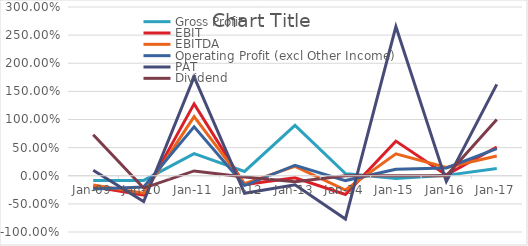
| Category | Gross Profit | EBIT | EBITDA | Operating Profit (excl Other Income) | PAT | Dividend |
|---|---|---|---|---|---|---|
| 2009-12-31 | -0.087 | -0.195 | -0.163 | -0.234 | 0.099 | 0.729 |
| 2010-12-31 | -0.082 | -0.346 | -0.309 | -0.2 | -0.458 | -0.219 |
| 2011-12-31 | 0.394 | 1.278 | 1.051 | 0.871 | 1.759 | 0.086 |
| 2012-12-31 | 0.077 | -0.157 | -0.139 | -0.175 | -0.311 | -0.022 |
| 2013-12-31 | 0.897 | -0.037 | 0.169 | 0.187 | -0.16 | -0.105 |
| 2014-12-31 | 0.04 | -0.334 | -0.254 | -0.086 | -0.77 | 0 |
| 2015-12-31 | -0.049 | 0.616 | 0.389 | 0.116 | 2.652 | 0 |
| 2016-12-31 | 0.007 | 0.015 | 0.146 | 0.139 | -0.1 | 0 |
| 2017-12-31 | 0.129 | 0.511 | 0.352 | 0.482 | 1.625 | 1 |